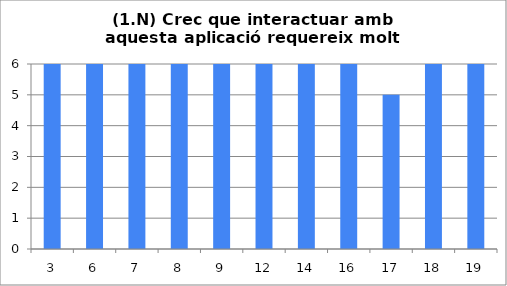
| Category | 1 |
|---|---|
| 3.0 | 6 |
| 6.0 | 6 |
| 7.0 | 6 |
| 8.0 | 6 |
| 9.0 | 6 |
| 12.0 | 6 |
| 14.0 | 6 |
| 16.0 | 6 |
| 17.0 | 5 |
| 18.0 | 6 |
| 19.0 | 6 |